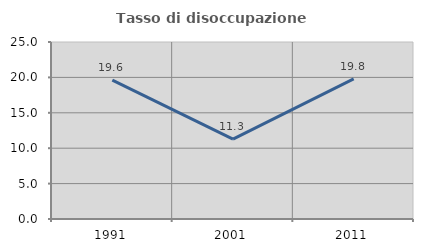
| Category | Tasso di disoccupazione giovanile  |
|---|---|
| 1991.0 | 19.604 |
| 2001.0 | 11.28 |
| 2011.0 | 19.802 |